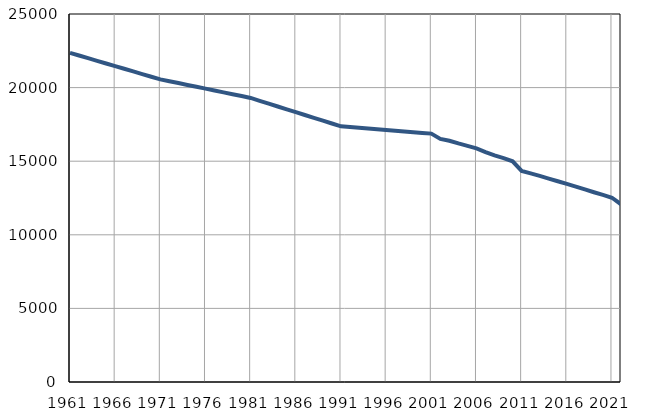
| Category | Population
size |
|---|---|
| 1961.0 | 22359 |
| 1962.0 | 22179 |
| 1963.0 | 21999 |
| 1964.0 | 21819 |
| 1965.0 | 21639 |
| 1966.0 | 21459 |
| 1967.0 | 21280 |
| 1968.0 | 21100 |
| 1969.0 | 20920 |
| 1970.0 | 20740 |
| 1971.0 | 20560 |
| 1972.0 | 20434 |
| 1973.0 | 20307 |
| 1974.0 | 20181 |
| 1975.0 | 20055 |
| 1976.0 | 19928 |
| 1977.0 | 19802 |
| 1978.0 | 19676 |
| 1979.0 | 19550 |
| 1980.0 | 19424 |
| 1981.0 | 19297 |
| 1982.0 | 19104 |
| 1983.0 | 18911 |
| 1984.0 | 18718 |
| 1985.0 | 18525 |
| 1986.0 | 18333 |
| 1987.0 | 18140 |
| 1988.0 | 17947 |
| 1989.0 | 17754 |
| 1990.0 | 17561 |
| 1991.0 | 17368 |
| 1992.0 | 17318 |
| 1993.0 | 17269 |
| 1994.0 | 17219 |
| 1995.0 | 17170 |
| 1996.0 | 17120 |
| 1997.0 | 17071 |
| 1998.0 | 17021 |
| 1999.0 | 16972 |
| 2000.0 | 16922 |
| 2001.0 | 16873 |
| 2002.0 | 16514 |
| 2003.0 | 16387 |
| 2004.0 | 16206 |
| 2005.0 | 16043 |
| 2006.0 | 15870 |
| 2007.0 | 15623 |
| 2008.0 | 15399 |
| 2009.0 | 15212 |
| 2010.0 | 14995 |
| 2011.0 | 14339 |
| 2012.0 | 14176 |
| 2013.0 | 14001 |
| 2014.0 | 13821 |
| 2015.0 | 13638 |
| 2016.0 | 13456 |
| 2017.0 | 13276 |
| 2018.0 | 13080 |
| 2019.0 | 12889 |
| 2020.0 | 12709 |
| 2021.0 | 12518 |
| 2022.0 | 12075 |